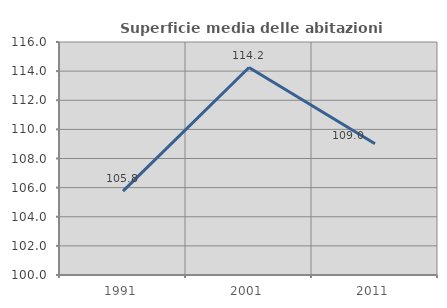
| Category | Superficie media delle abitazioni occupate |
|---|---|
| 1991.0 | 105.757 |
| 2001.0 | 114.248 |
| 2011.0 | 109.018 |